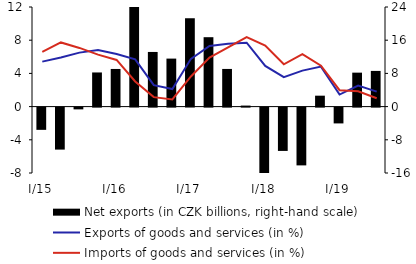
| Category | Net exports (in CZK billions, right-hand scale) |
|---|---|
| I/15 | -5.361 |
| II | -10.121 |
| III | -0.427 |
| IV | 8.227 |
| I/16 | 9.069 |
| II | 24.031 |
| III | 13.168 |
| IV | 11.567 |
| I/17 | 21.305 |
| II | 16.723 |
| III | 9.075 |
| IV | 0.245 |
| I/18 | -16.778 |
| II | -10.439 |
| III | -13.924 |
| IV | 2.631 |
| I/19 | -3.811 |
| II | 8.182 |
| III | 8.6 |